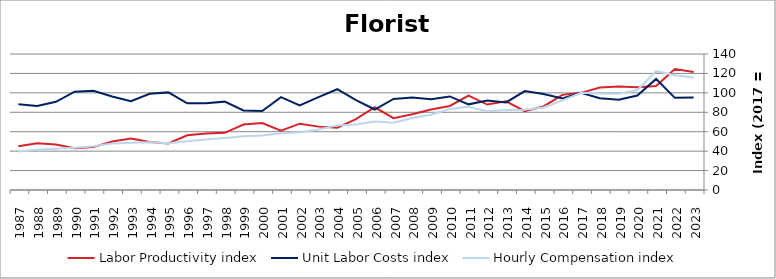
| Category | Labor Productivity index | Unit Labor Costs index | Hourly Compensation index |
|---|---|---|---|
| 2023.0 | 121.573 | 95.261 | 115.811 |
| 2022.0 | 124.524 | 94.877 | 118.144 |
| 2021.0 | 107.084 | 114.292 | 122.388 |
| 2020.0 | 105.864 | 97.259 | 102.962 |
| 2019.0 | 106.63 | 92.82 | 98.973 |
| 2018.0 | 105.404 | 94.365 | 99.464 |
| 2017.0 | 100 | 100 | 100 |
| 2016.0 | 97.935 | 94.175 | 92.231 |
| 2015.0 | 85.997 | 98.799 | 84.964 |
| 2014.0 | 81.211 | 101.837 | 82.703 |
| 2013.0 | 91.273 | 90.141 | 82.275 |
| 2012.0 | 87.951 | 92.231 | 81.118 |
| 2011.0 | 97.087 | 88.173 | 85.605 |
| 2010.0 | 86.484 | 96.326 | 83.307 |
| 2009.0 | 82.904 | 93.491 | 77.508 |
| 2008.0 | 77.907 | 95.257 | 74.212 |
| 2007.0 | 73.927 | 93.771 | 69.323 |
| 2006.0 | 85.162 | 82.867 | 70.571 |
| 2005.0 | 72.873 | 92.603 | 67.483 |
| 2004.0 | 64.111 | 103.749 | 66.515 |
| 2003.0 | 65.238 | 95.604 | 62.37 |
| 2002.0 | 68.277 | 86.986 | 59.391 |
| 2001.0 | 61.048 | 95.626 | 58.378 |
| 2000.0 | 69.008 | 81.312 | 56.112 |
| 1999.0 | 67.406 | 81.901 | 55.206 |
| 1998.0 | 58.888 | 90.956 | 53.562 |
| 1997.0 | 58.267 | 89.333 | 52.052 |
| 1996.0 | 56.278 | 89.287 | 50.249 |
| 1995.0 | 47.981 | 100.483 | 48.212 |
| 1994.0 | 49.485 | 99.085 | 49.032 |
| 1993.0 | 53.107 | 91.399 | 48.539 |
| 1992.0 | 49.832 | 96.297 | 47.987 |
| 1991.0 | 44.175 | 102.066 | 45.087 |
| 1990.0 | 42.936 | 101.214 | 43.457 |
| 1989.0 | 46.75 | 90.797 | 42.448 |
| 1988.0 | 48.03 | 86.446 | 41.521 |
| 1987.0 | 45.052 | 88.177 | 39.725 |